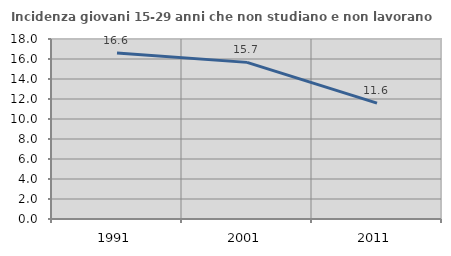
| Category | Incidenza giovani 15-29 anni che non studiano e non lavorano  |
|---|---|
| 1991.0 | 16.595 |
| 2001.0 | 15.663 |
| 2011.0 | 11.588 |